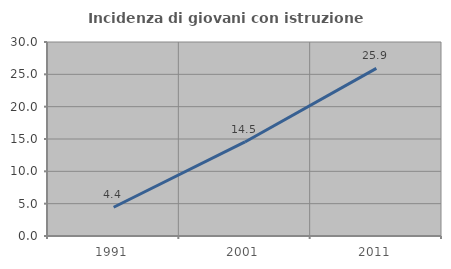
| Category | Incidenza di giovani con istruzione universitaria |
|---|---|
| 1991.0 | 4.444 |
| 2001.0 | 14.545 |
| 2011.0 | 25.926 |